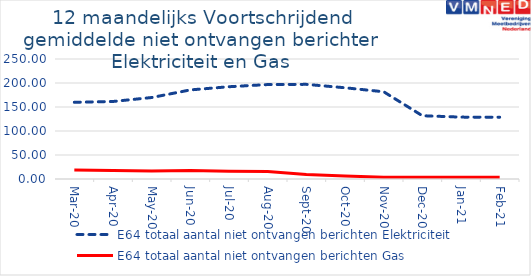
| Category | E64 totaal aantal niet ontvangen berichten Elektriciteit | E64 totaal aantal niet ontvangen berichten Gas |
|---|---|---|
| 2020-03-01 | 159.833 | 18.667 |
| 2020-04-01 | 161.5 | 17.75 |
| 2020-05-01 | 169.75 | 16.75 |
| 2020-06-01 | 185.583 | 17.75 |
| 2020-07-01 | 192.25 | 16.25 |
| 2020-08-01 | 196.75 | 15.833 |
| 2020-09-01 | 197.167 | 9.5 |
| 2020-10-01 | 190.083 | 6.417 |
| 2020-11-01 | 181.75 | 3.75 |
| 2020-12-01 | 131.833 | 3.5 |
| 2021-01-01 | 128.917 | 3.75 |
| 2021-02-01 | 128.75 | 3.667 |